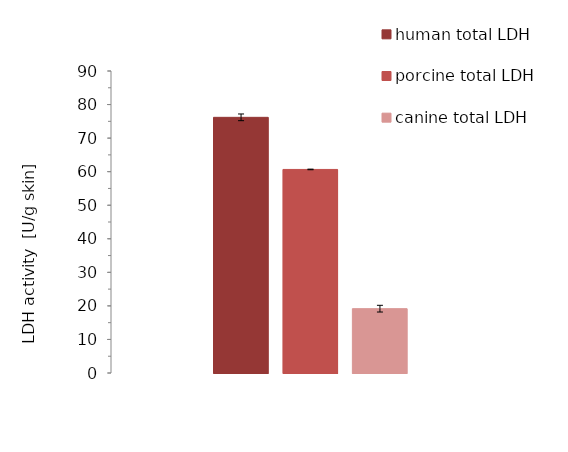
| Category | human total LDH | porcine total LDH | canine total LDH |
|---|---|---|---|
| 0 | 76.193 | 60.663 | 19.174 |